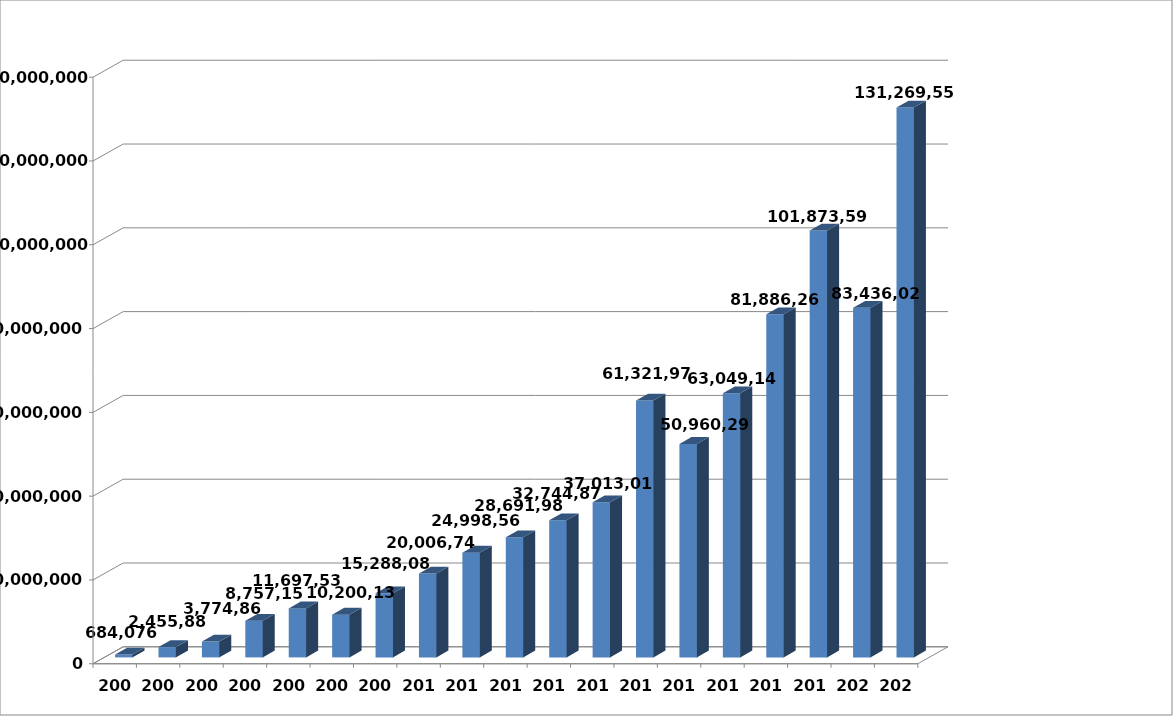
| Category | Series 0 |
|---|---|
| 2003.0 | 684076 |
| 2004.0 | 2455887 |
| 2005.0 | 3774862 |
| 2006.0 | 8757158 |
| 2007.0 | 11697533 |
| 2008.0 | 10200135 |
| 2009.0 | 15288081 |
| 2010.0 | 20006747 |
| 2011.0 | 24998569 |
| 2012.0 | 28691981 |
| 2013.0 | 32744871.19 |
| 2014.0 | 37013011 |
| 2015.0 | 61321970 |
| 2016.0 | 50960294 |
| 2017.0 | 63049146 |
| 2018.0 | 81886269 |
| 2019.0 | 101873595 |
| 2020.0 | 83436028 |
| 2021.0 | 131269556 |